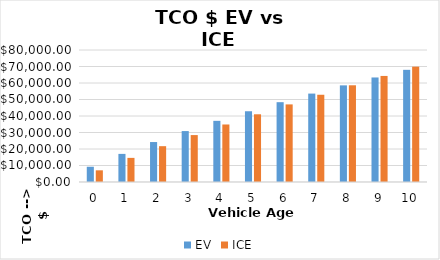
| Category | EV | ICE |
|---|---|---|
| 0.0 | 9249.45 | 7082.32 |
| 1.0 | 17038.03 | 14623.576 |
| 2.0 | 24215.286 | 21715.324 |
| 3.0 | 30866.689 | 28437.565 |
| 4.0 | 37067.254 | 34859.254 |
| 5.0 | 42882.849 | 41039.89 |
| 6.0 | 48371.349 | 47030.872 |
| 7.0 | 53583.637 | 52876.677 |
| 8.0 | 58564.485 | 58615.853 |
| 9.0 | 63353.327 | 64281.881 |
| 10.0 | 67984.927 | 69903.91 |